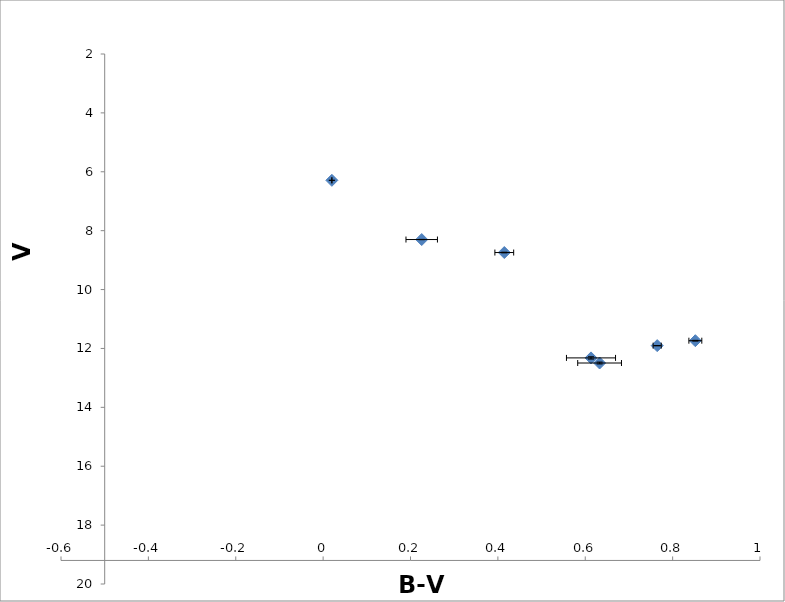
| Category | Series 0 |
|---|---|
| 0.225666666666665 | 8.301 |
| 0.414666666666667 | 8.743 |
| 0.0199999999999996 | 6.29 |
| 0.764666666666667 | 11.904 |
| 0.852 | 11.737 |
| 0.632833333333332 | 12.495 |
| 0.613166666666666 | 12.321 |
| 0.0 | 0 |
| 0.0 | 0 |
| 0.0 | 0 |
| 0.0 | 0 |
| 0.0 | 0 |
| 0.0 | 0 |
| 0.0 | 0 |
| 0.0 | 0 |
| 0.0 | 0 |
| 0.0 | 0 |
| 0.0 | 0 |
| 0.0 | 0 |
| 0.0 | 0 |
| 0.0 | 0 |
| 0.0 | 0 |
| 0.0 | 0 |
| 0.0 | 0 |
| 0.0 | 0 |
| 0.0 | 0 |
| 0.0 | 0 |
| 0.0 | 0 |
| 0.0 | 0 |
| 0.0 | 0 |
| 0.0 | 0 |
| 0.0 | 0 |
| 0.0 | 0 |
| 0.0 | 0 |
| 0.0 | 0 |
| 0.0 | 0 |
| 0.0 | 0 |
| 0.0 | 0 |
| 0.0 | 0 |
| 0.0 | 0 |
| 0.0 | 0 |
| 0.0 | 0 |
| 0.0 | 0 |
| 0.0 | 0 |
| 0.0 | 0 |
| 0.0 | 0 |
| 0.0 | 0 |
| 0.0 | 0 |
| 0.0 | 0 |
| 0.0 | 0 |
| 0.0 | 0 |
| 0.0 | 0 |
| 0.0 | 0 |
| 0.0 | 0 |
| 0.0 | 0 |
| 0.0 | 0 |
| 0.0 | 0 |
| 0.0 | 0 |
| 0.0 | 0 |
| 0.0 | 0 |
| 0.0 | 0 |
| 0.0 | 0 |
| 0.0 | 0 |
| 0.0 | 0 |
| 0.0 | 0 |
| 0.0 | 0 |
| 0.0 | 0 |
| 0.0 | 0 |
| 0.0 | 0 |
| 0.0 | 0 |
| 0.0 | 0 |
| 0.0 | 0 |
| 0.0 | 0 |
| 0.0 | 0 |
| 0.0 | 0 |
| 0.0 | 0 |
| 0.0 | 0 |
| 0.0 | 0 |
| 0.0 | 0 |
| 0.0 | 0 |
| 0.0 | 0 |
| 0.0 | 0 |
| 0.0 | 0 |
| 0.0 | 0 |
| 0.0 | 0 |
| 0.0 | 0 |
| 0.0 | 0 |
| 0.0 | 0 |
| 0.0 | 0 |
| 0.0 | 0 |
| 0.0 | 0 |
| 0.0 | 0 |
| 0.0 | 0 |
| 0.0 | 0 |
| 0.0 | 0 |
| 0.0 | 0 |
| 0.0 | 0 |
| 0.0 | 0 |
| 0.0 | 0 |
| 0.0 | 0 |
| 0.0 | 0 |
| 0.0 | 0 |
| 0.0 | 0 |
| 0.0 | 0 |
| 0.0 | 0 |
| 0.0 | 0 |
| 0.0 | 0 |
| 0.0 | 0 |
| 0.0 | 0 |
| 0.0 | 0 |
| 0.0 | 0 |
| 0.0 | 0 |
| 0.0 | 0 |
| 0.0 | 0 |
| 0.0 | 0 |
| 0.0 | 0 |
| 0.0 | 0 |
| 0.0 | 0 |
| 0.0 | 0 |
| 0.0 | 0 |
| 0.0 | 0 |
| 0.0 | 0 |
| 0.0 | 0 |
| 0.0 | 0 |
| 0.0 | 0 |
| 0.0 | 0 |
| 0.0 | 0 |
| 0.0 | 0 |
| 0.0 | 0 |
| 0.0 | 0 |
| 0.0 | 0 |
| 0.0 | 0 |
| 0.0 | 0 |
| 0.0 | 0 |
| 0.0 | 0 |
| 0.0 | 0 |
| 0.0 | 0 |
| 0.0 | 0 |
| 0.0 | 0 |
| 0.0 | 0 |
| 0.0 | 0 |
| 0.0 | 0 |
| 0.0 | 0 |
| 0.0 | 0 |
| 0.0 | 0 |
| 0.0 | 0 |
| 0.0 | 0 |
| 0.0 | 0 |
| 0.0 | 0 |
| 0.0 | 0 |
| 0.0 | 0 |
| 0.0 | 0 |
| 0.0 | 0 |
| 0.0 | 0 |
| 0.0 | 0 |
| 0.0 | 0 |
| 0.0 | 0 |
| 0.0 | 0 |
| 0.0 | 0 |
| 0.0 | 0 |
| 0.0 | 0 |
| 0.0 | 0 |
| 0.0 | 0 |
| 0.0 | 0 |
| 0.0 | 0 |
| 0.0 | 0 |
| 0.0 | 0 |
| 0.0 | 0 |
| 0.0 | 0 |
| 0.0 | 0 |
| 0.0 | 0 |
| 0.0 | 0 |
| 0.0 | 0 |
| 0.0 | 0 |
| 0.0 | 0 |
| 0.0 | 0 |
| 0.0 | 0 |
| 0.0 | 0 |
| 0.0 | 0 |
| 0.0 | 0 |
| 0.0 | 0 |
| 0.0 | 0 |
| 0.0 | 0 |
| 0.0 | 0 |
| 0.0 | 0 |
| 0.0 | 0 |
| 0.0 | 0 |
| 0.0 | 0 |
| 0.0 | 0 |
| 0.0 | 0 |
| 0.0 | 0 |
| 0.0 | 0 |
| 0.0 | 0 |
| 0.0 | 0 |
| 0.0 | 0 |
| 0.0 | 0 |
| 0.0 | 0 |
| 0.0 | 0 |
| 0.0 | 0 |
| 0.0 | 0 |
| 0.0 | 0 |
| 0.0 | 0 |
| 0.0 | 0 |
| 0.0 | 0 |
| 0.0 | 0 |
| 0.0 | 0 |
| 0.0 | 0 |
| 0.0 | 0 |
| 0.0 | 0 |
| 0.0 | 0 |
| 0.0 | 0 |
| 0.0 | 0 |
| 0.0 | 0 |
| 0.0 | 0 |
| 0.0 | 0 |
| 0.0 | 0 |
| 0.0 | 0 |
| 0.0 | 0 |
| 0.0 | 0 |
| 0.0 | 0 |
| 0.0 | 0 |
| 0.0 | 0 |
| 0.0 | 0 |
| 0.0 | 0 |
| 0.0 | 0 |
| 0.0 | 0 |
| 0.0 | 0 |
| 0.0 | 0 |
| 0.0 | 0 |
| 0.0 | 0 |
| 0.0 | 0 |
| 0.0 | 0 |